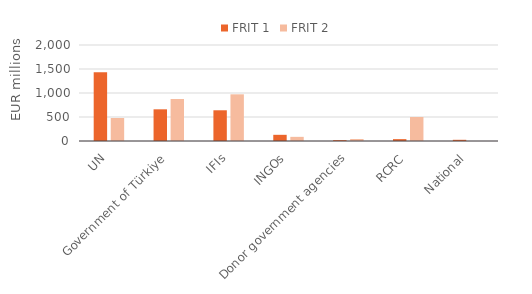
| Category | FRIT 1 | FRIT 2 |
|---|---|---|
| UN | 1430.432 | 478.597 |
| Government of Türkiye | 660 | 875 |
| IFIs | 640 | 972.498 |
| INGOs | 128.828 | 86.368 |
| Donor government agencies | 18.208 | 42.25 |
| RCRC | 38.73 | 500 |
| National | 24.938 | 0 |